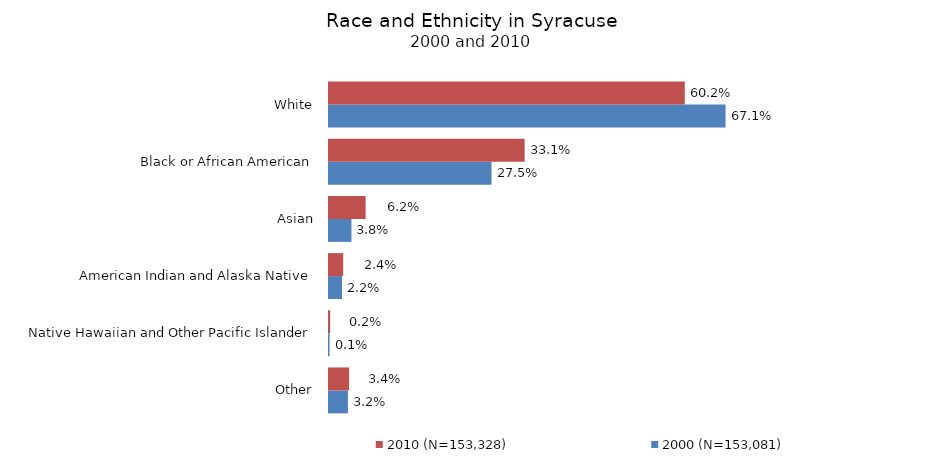
| Category | 2000 (N=153,081) | 2010 (N=153,328) |
|---|---|---|
| Other | 0.032 | 0.034 |
| Native Hawaiian and Other Pacific Islander | 0.001 | 0.002 |
| American Indian and Alaska Native | 0.022 | 0.024 |
| Asian | 0.038 | 0.062 |
| Black or African American | 0.275 | 0.331 |
| White | 0.671 | 0.602 |